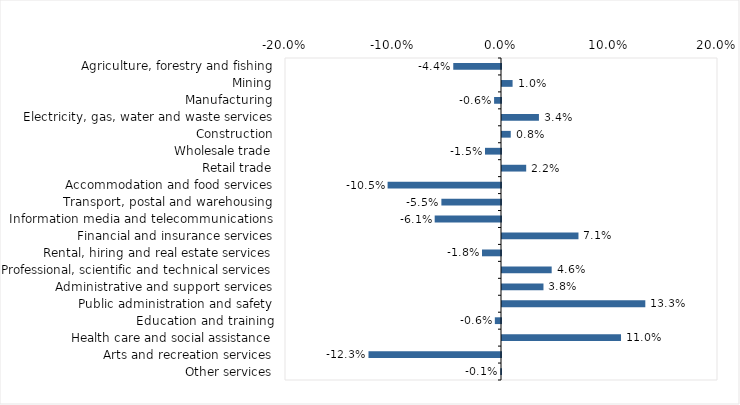
| Category | This week |
|---|---|
| Agriculture, forestry and fishing | -0.044 |
| Mining | 0.01 |
| Manufacturing | -0.006 |
| Electricity, gas, water and waste services | 0.034 |
| Construction | 0.008 |
| Wholesale trade | -0.015 |
| Retail trade | 0.022 |
| Accommodation and food services | -0.105 |
| Transport, postal and warehousing | -0.055 |
| Information media and telecommunications | -0.061 |
| Financial and insurance services | 0.071 |
| Rental, hiring and real estate services | -0.018 |
| Professional, scientific and technical services | 0.046 |
| Administrative and support services | 0.038 |
| Public administration and safety | 0.133 |
| Education and training | -0.006 |
| Health care and social assistance | 0.11 |
| Arts and recreation services | -0.123 |
| Other services | -0.001 |